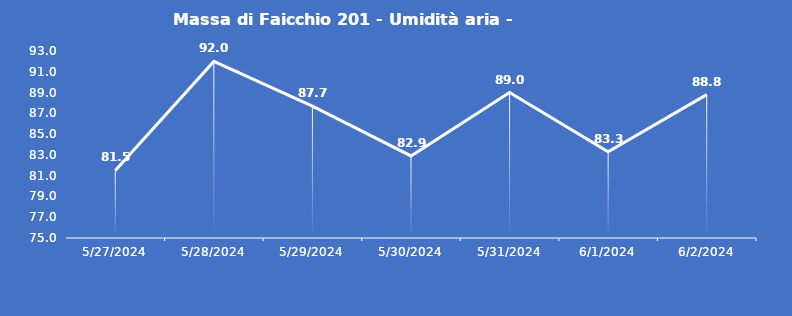
| Category | Massa di Faicchio 201 - Umidità aria - Grezzo (%) |
|---|---|
| 5/27/24 | 81.5 |
| 5/28/24 | 92 |
| 5/29/24 | 87.7 |
| 5/30/24 | 82.9 |
| 5/31/24 | 89 |
| 6/1/24 | 83.3 |
| 6/2/24 | 88.8 |